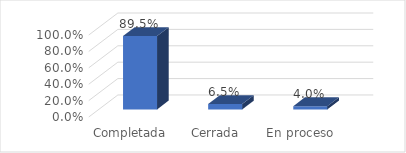
| Category | ESTADO DE SOLICITUDES |
|---|---|
| Completada | 0.895 |
| Cerrada | 0.065 |
| En proceso | 0.04 |